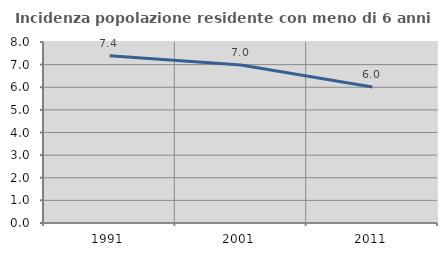
| Category | Incidenza popolazione residente con meno di 6 anni |
|---|---|
| 1991.0 | 7.397 |
| 2001.0 | 6.983 |
| 2011.0 | 6.012 |